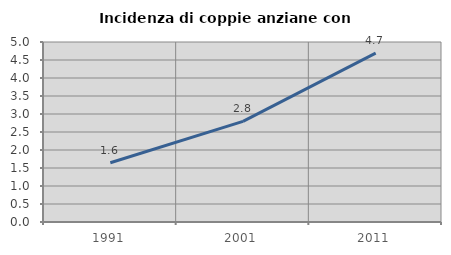
| Category | Incidenza di coppie anziane con figli |
|---|---|
| 1991.0 | 1.646 |
| 2001.0 | 2.795 |
| 2011.0 | 4.69 |